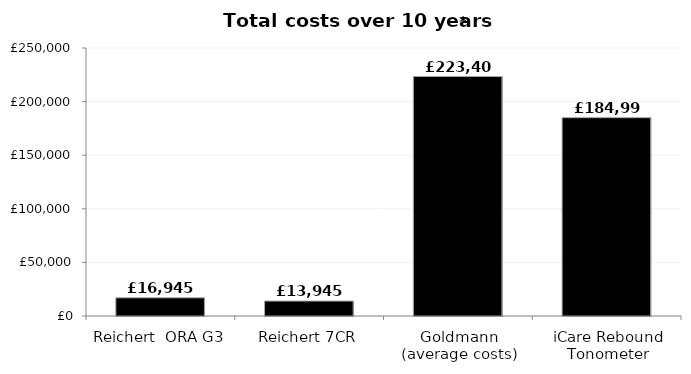
| Category | Series 0 |
|---|---|
| Reichert  ORA G3 | 16945 |
| Reichert 7CR | 13945 |
| Goldmann (average costs) | 223400 |
| iCare Rebound Tonometer | 184995 |